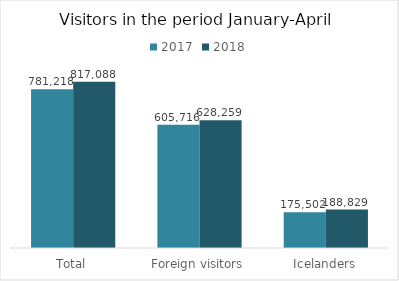
| Category | 2017 | 2018 |
|---|---|---|
| Total | 781218 | 817088 |
| Foreign visitors | 605716 | 628259 |
| Icelanders | 175502 | 188829 |